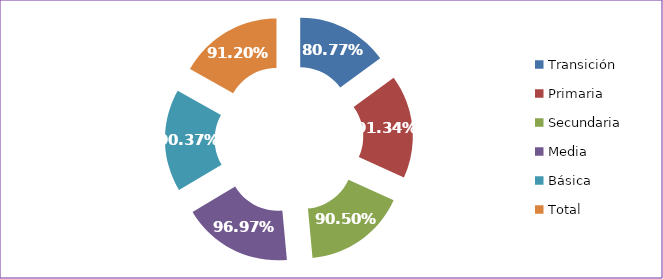
| Category | Tasa Aprobación |
|---|---|
| Transición | 0.808 |
| Primaria | 0.913 |
| Secundaria | 0.905 |
| Media | 0.97 |
| Básica | 0.904 |
| Total | 0.912 |